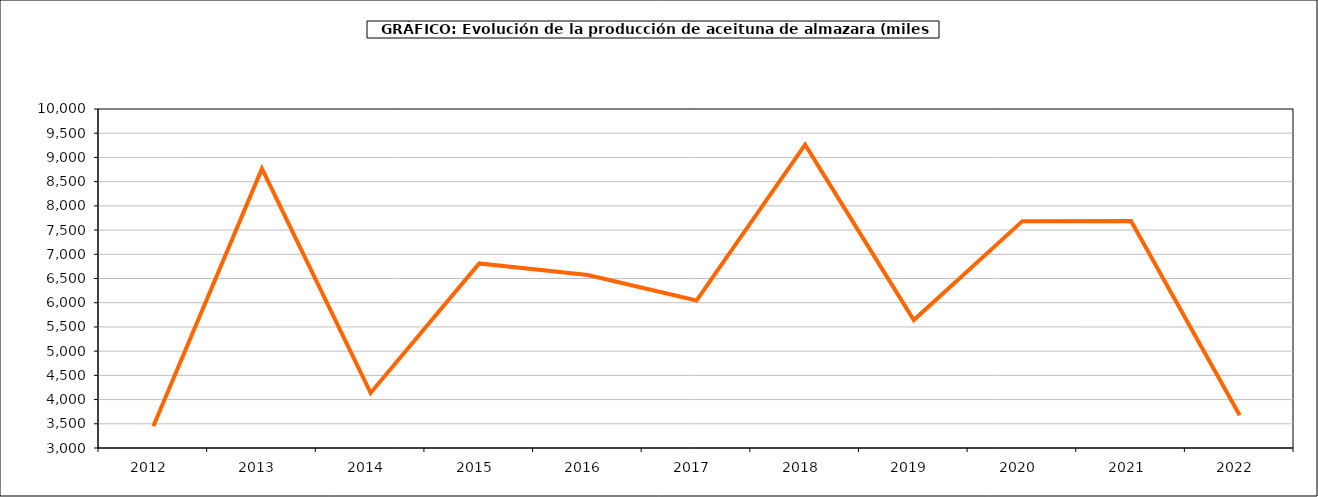
| Category | producción |
|---|---|
| 2012.0 | 3448.612 |
| 2013.0 | 8766.897 |
| 2014.0 | 4136.73 |
| 2015.0 | 6811.611 |
| 2016.0 | 6571.428 |
| 2017.0 | 6044.453 |
| 2018.0 | 9264.536 |
| 2019.0 | 5642.056 |
| 2020.0 | 7684.413 |
| 2021.0 | 7687.565 |
| 2022.0 | 3677.791 |